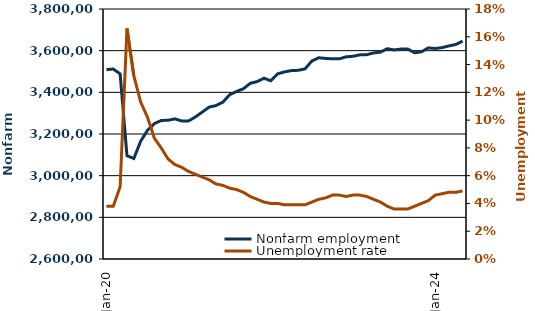
| Category |  Nonfarm employment  |
|---|---|
| 2020-01-01 | 3508800 |
| 2020-02-01 | 3511900 |
| 2020-03-01 | 3488600 |
| 2020-04-01 | 3096100 |
| 2020-05-01 | 3082300 |
| 2020-06-01 | 3165300 |
| 2020-07-01 | 3217800 |
| 2020-08-01 | 3249900 |
| 2020-09-01 | 3264900 |
| 2020-10-01 | 3266000 |
| 2020-11-01 | 3272700 |
| 2020-12-01 | 3262300 |
| 2021-01-01 | 3262700 |
| 2021-02-01 | 3282000 |
| 2021-03-01 | 3305400 |
| 2021-04-01 | 3329200 |
| 2021-05-01 | 3336400 |
| 2021-06-01 | 3352900 |
| 2021-07-01 | 3388600 |
| 2021-08-01 | 3404200 |
| 2021-09-01 | 3417400 |
| 2021-10-01 | 3443200 |
| 2021-11-01 | 3451600 |
| 2021-12-01 | 3467900 |
| 2022-01-01 | 3455300 |
| 2022-02-01 | 3489000 |
| 2022-03-01 | 3497900 |
| 2022-04-01 | 3504400 |
| 2022-05-01 | 3505600 |
| 2022-06-01 | 3512600 |
| 2022-07-01 | 3550700 |
| 2022-08-01 | 3565900 |
| 2022-09-01 | 3562800 |
| 2022-10-01 | 3560900 |
| 2022-11-01 | 3560800 |
| 2022-12-01 | 3570400 |
| 2023-01-01 | 3573000 |
| 2023-02-01 | 3580000 |
| 2023-03-01 | 3580700 |
| 2023-04-01 | 3589000 |
| 2023-05-01 | 3592900 |
| 2023-06-01 | 3609400 |
| 2023-07-01 | 3603500 |
| 2023-08-01 | 3607600 |
| 2023-09-01 | 3607900 |
| 2023-10-01 | 3589700 |
| 2023-11-01 | 3594600 |
| 2023-12-01 | 3613200 |
| 2024-01-01 | 3610500 |
| 2024-02-01 | 3614400 |
| 2024-03-01 | 3622800 |
| 2024-04-01 | 3629600 |
| 2024-05-01 | 3645600 |